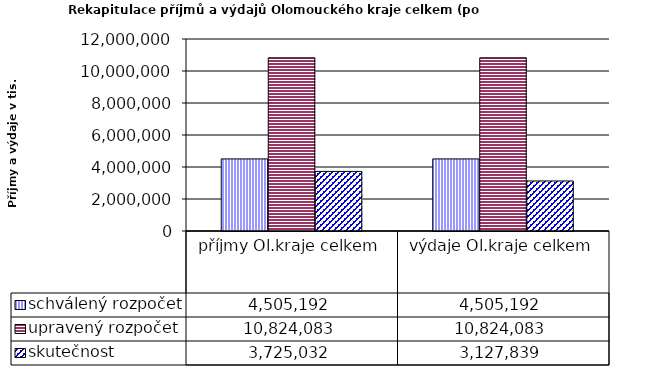
| Category | schválený rozpočet | upravený rozpočet | skutečnost |
|---|---|---|---|
| příjmy Ol.kraje celkem | 4505192 | 10824083 | 3725032 |
| výdaje Ol.kraje celkem | 4505192 | 10824083 | 3127839 |